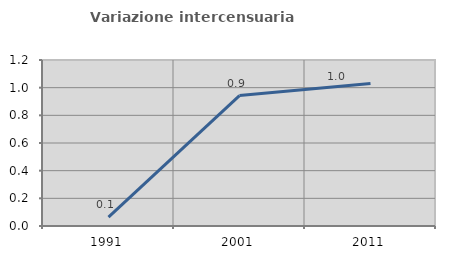
| Category | Variazione intercensuaria annua |
|---|---|
| 1991.0 | 0.064 |
| 2001.0 | 0.943 |
| 2011.0 | 1.03 |